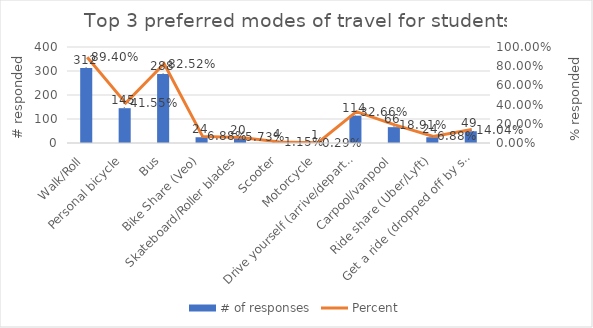
| Category | # of responses |
|---|---|
| Walk/Roll | 312 |
| Personal bicycle | 145 |
| Bus | 288 |
| Bike Share (Veo) | 24 |
| Skateboard/Roller blades | 20 |
| Scooter | 4 |
| Motorcycle | 1 |
| Drive yourself (arrive/depart alone) | 114 |
| Carpool/vanpool | 66 |
| Ride share (Uber/Lyft) | 24 |
| Get a ride (dropped off by someone who goes elsewhere... not in campus | 49 |